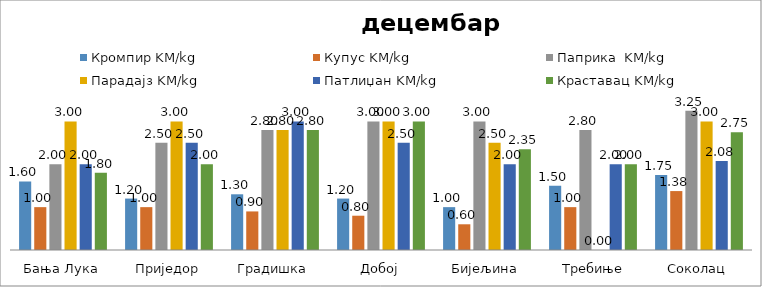
| Category | Кромпир KM/kg | Купус KM/kg | Паприка  KM/kg | Парадајз KM/kg | Патлиџан KM/kg | Краставац KM/kg |
|---|---|---|---|---|---|---|
| Бања Лука | 1.6 | 1 | 2 | 3 | 2 | 1.8 |
| Приједор | 1.2 | 1 | 2.5 | 3 | 2.5 | 2 |
| Градишка | 1.3 | 0.9 | 2.8 | 2.8 | 3 | 2.8 |
| Добој | 1.2 | 0.8 | 3 | 3 | 2.5 | 3 |
| Бијељина | 1 | 0.6 | 3 | 2.5 | 2 | 2.35 |
|  Требиње | 1.5 | 1 | 2.8 | 0 | 2 | 2 |
| Соколац | 1.75 | 1.375 | 3.25 | 3 | 2.075 | 2.75 |